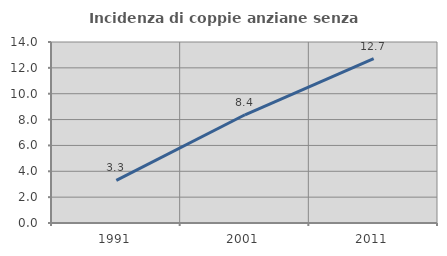
| Category | Incidenza di coppie anziane senza figli  |
|---|---|
| 1991.0 | 3.297 |
| 2001.0 | 8.37 |
| 2011.0 | 12.712 |